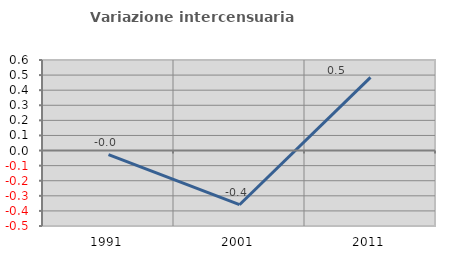
| Category | Variazione intercensuaria annua |
|---|---|
| 1991.0 | -0.027 |
| 2001.0 | -0.359 |
| 2011.0 | 0.485 |